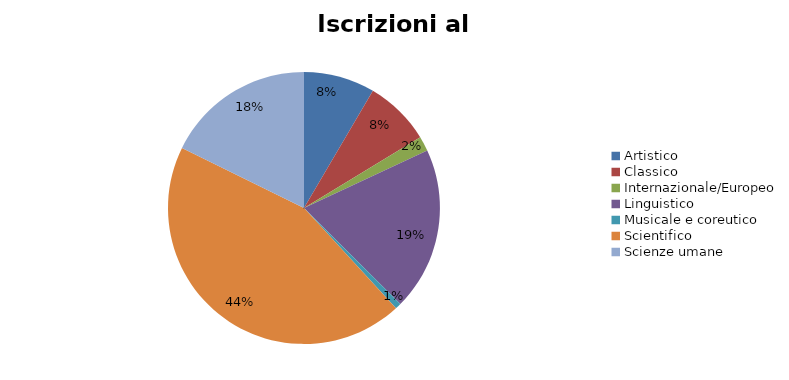
| Category | Series 0 | Series 1 |
|---|---|---|
| Artistico | 1555 |  |
| Classico | 1444 |  |
| Internazionale/Europeo | 320 |  |
| Linguistico | 3571 |  |
| Musicale e coreutico | 131 |  |
| Scientifico | 8109 |  |
| Scienze umane | 3258 |  |